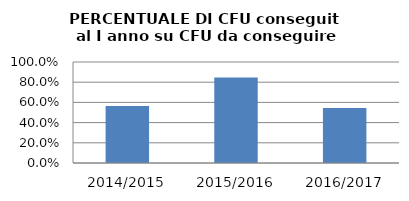
| Category | 2014/2015 2015/2016 2016/2017 |
|---|---|
| 2014/2015 | 0.565 |
| 2015/2016 | 0.847 |
| 2016/2017 | 0.545 |